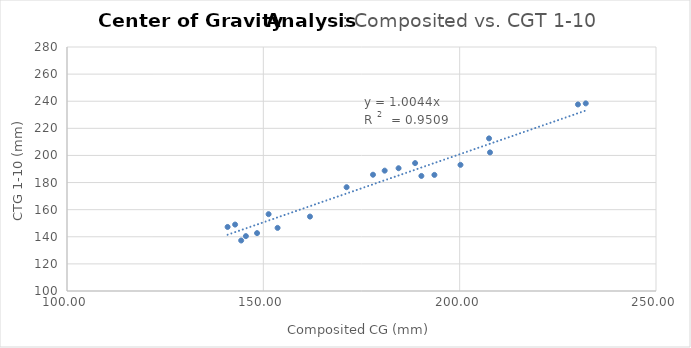
| Category | Series 0 |
|---|---|
| 145.5562157 | 140.48 |
| 188.6489913 | 194.35 |
| 161.8796258 | 154.9 |
| 190.2504264 | 184.88 |
| 180.9020683 | 188.78 |
| 153.6283657 | 146.56 |
| 148.4034235 | 142.7 |
| 171.2077679 | 176.57 |
| 140.9003367 | 147.24 |
| 142.811204 | 149.01 |
| 144.3612394 | 137.26 |
| 151.3398537 | 156.68 |
| 193.5664972 | 185.65 |
| 230.1253759 | 237.62 |
| 232.1105515 | 238.41 |
| 207.7258776 | 202.24 |
| 177.9270695 | 185.78 |
| 207.4812201 | 212.57 |
| 184.441705 | 190.57 |
| 200.2085742 | 193.06 |